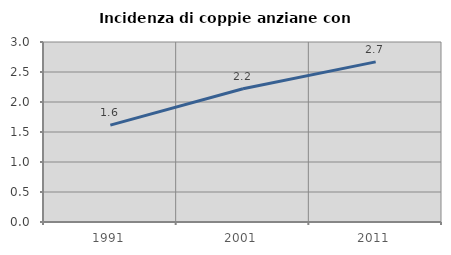
| Category | Incidenza di coppie anziane con figli |
|---|---|
| 1991.0 | 1.615 |
| 2001.0 | 2.22 |
| 2011.0 | 2.669 |